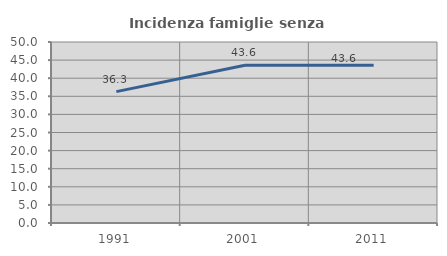
| Category | Incidenza famiglie senza nuclei |
|---|---|
| 1991.0 | 36.299 |
| 2001.0 | 43.59 |
| 2011.0 | 43.592 |